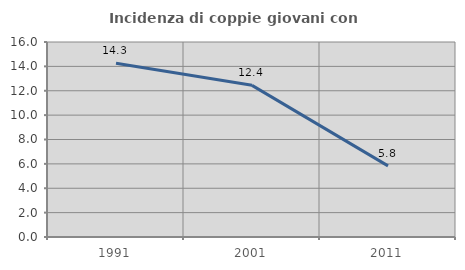
| Category | Incidenza di coppie giovani con figli |
|---|---|
| 1991.0 | 14.256 |
| 2001.0 | 12.443 |
| 2011.0 | 5.836 |